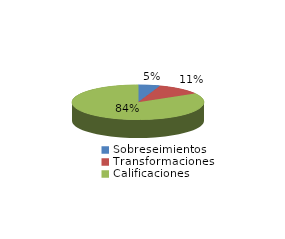
| Category | Series 0 |
|---|---|
| Sobreseimientos | 56 |
| Transformaciones | 116 |
| Calificaciones | 873 |